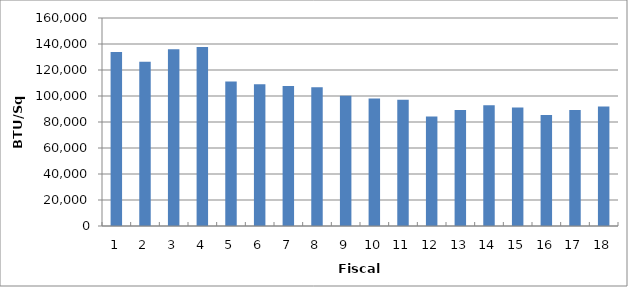
| Category | Series 0 |
|---|---|
| 0 | 133873 |
| 1 | 126427 |
| 2 | 136020 |
| 3 | 137702 |
| 4 | 111122 |
| 5 | 108961 |
| 6 | 107717.503 |
| 7 | 106638.377 |
| 8 | 100205.448 |
| 9 | 98126.067 |
| 10 | 97043.865 |
| 11 | 84175 |
| 12 | 89149.351 |
| 13 | 92816 |
| 14 | 91096 |
| 15 | 85457 |
| 16 | 89231 |
| 17 | 91885 |